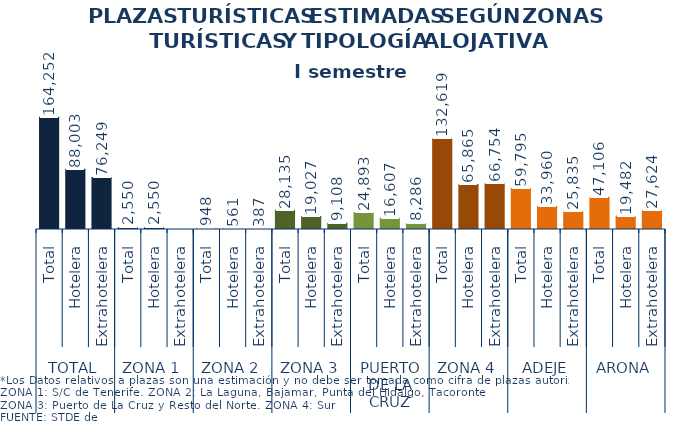
| Category | I semestre 2013 |
|---|---|
| 0 | 164252 |
| 1 | 88003 |
| 2 | 76249 |
| 3 | 2550 |
| 4 | 2550 |
| 5 | 0 |
| 6 | 948 |
| 7 | 561 |
| 8 | 387 |
| 9 | 28135 |
| 10 | 19027 |
| 11 | 9108 |
| 12 | 24893 |
| 13 | 16607 |
| 14 | 8286 |
| 15 | 132619 |
| 16 | 65865 |
| 17 | 66754 |
| 18 | 59795 |
| 19 | 33960 |
| 20 | 25835 |
| 21 | 47106 |
| 22 | 19482 |
| 23 | 27624 |